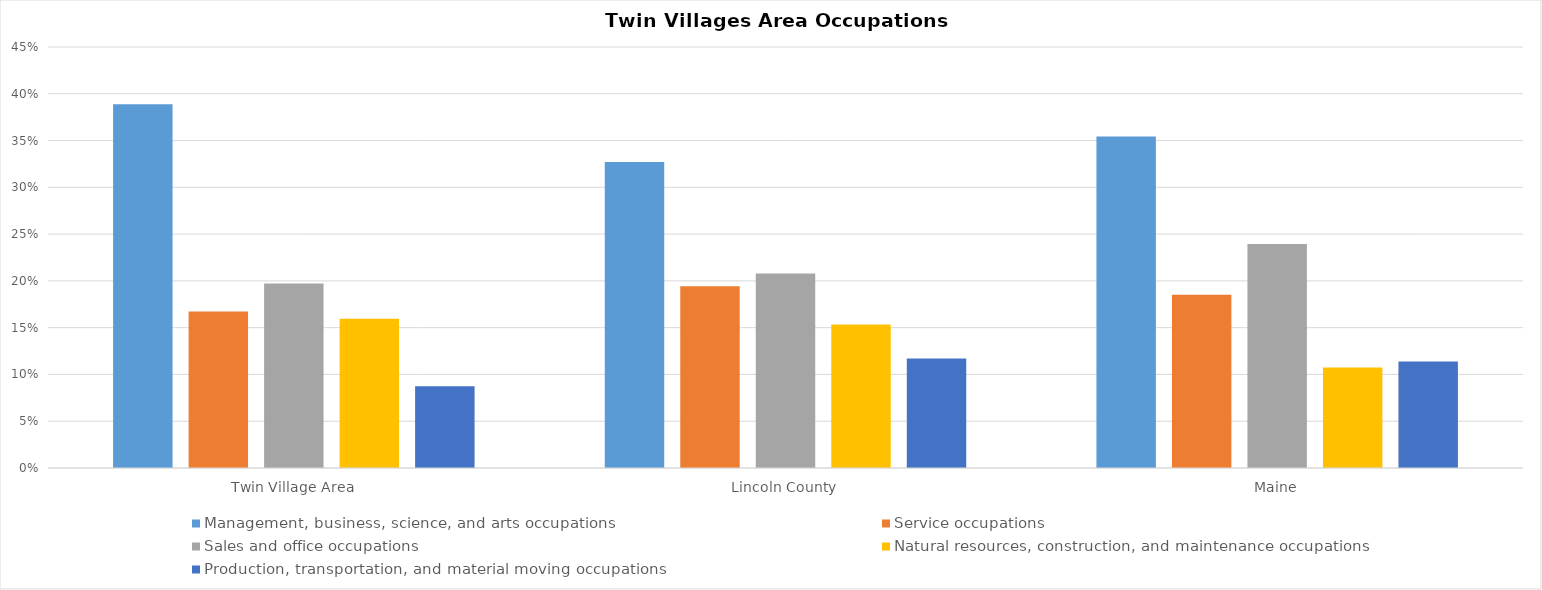
| Category | Management, business, science, and arts occupations | Service occupations | Sales and office occupations | Natural resources, construction, and maintenance occupations | Production, transportation, and material moving occupations |
|---|---|---|---|---|---|
| Twin Village Area | 0.389 | 0.167 | 0.197 | 0.159 | 0.087 |
| Lincoln County | 0.327 | 0.194 | 0.208 | 0.153 | 0.117 |
| Maine | 0.354 | 0.185 | 0.239 | 0.107 | 0.114 |